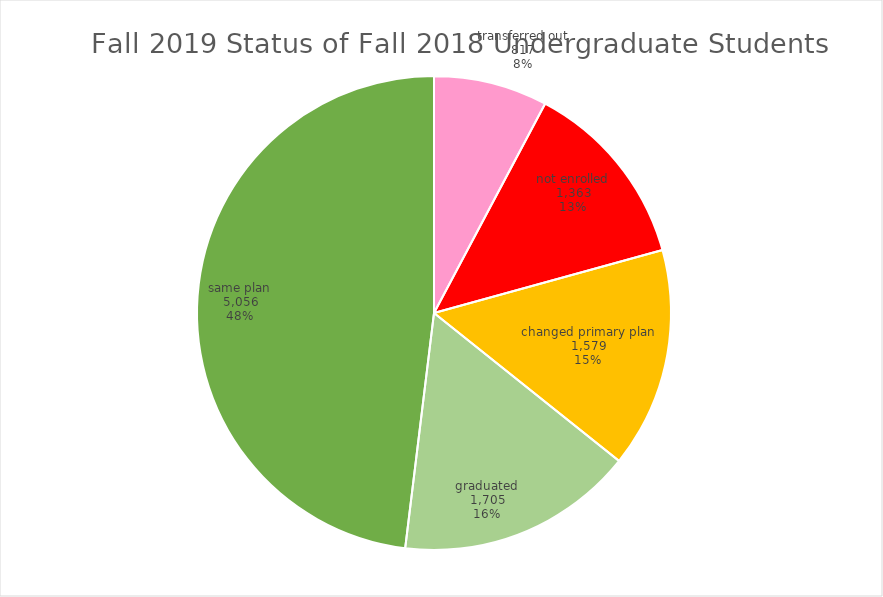
| Category |  Total  |
|---|---|
| transferred out | 817 |
| not enrolled | 1363 |
| changed primary plan | 1579 |
| graduated | 1705 |
| same plan | 5056 |